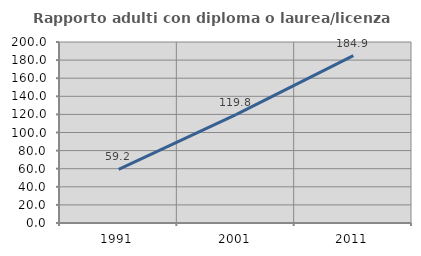
| Category | Rapporto adulti con diploma o laurea/licenza media  |
|---|---|
| 1991.0 | 59.198 |
| 2001.0 | 119.765 |
| 2011.0 | 184.943 |